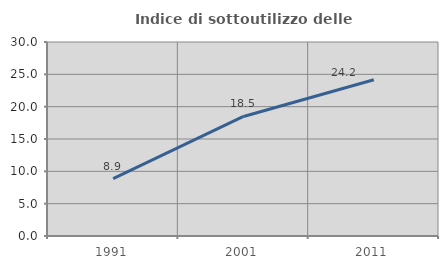
| Category | Indice di sottoutilizzo delle abitazioni  |
|---|---|
| 1991.0 | 8.861 |
| 2001.0 | 18.489 |
| 2011.0 | 24.164 |